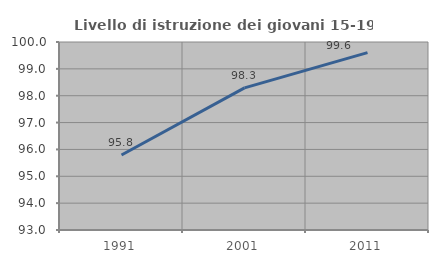
| Category | Livello di istruzione dei giovani 15-19 anni |
|---|---|
| 1991.0 | 95.793 |
| 2001.0 | 98.291 |
| 2011.0 | 99.603 |